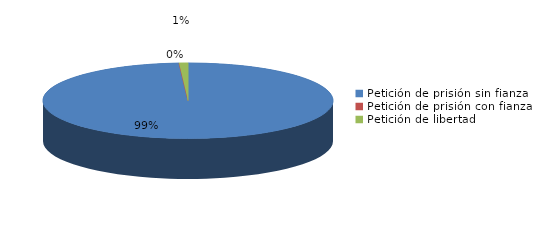
| Category | Series 0 |
|---|---|
| Petición de prisión sin fianza | 100 |
| Petición de prisión con fianza | 0 |
| Petición de libertad | 1 |